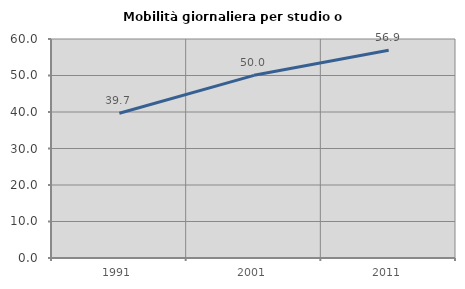
| Category | Mobilità giornaliera per studio o lavoro |
|---|---|
| 1991.0 | 39.665 |
| 2001.0 | 50.047 |
| 2011.0 | 56.92 |